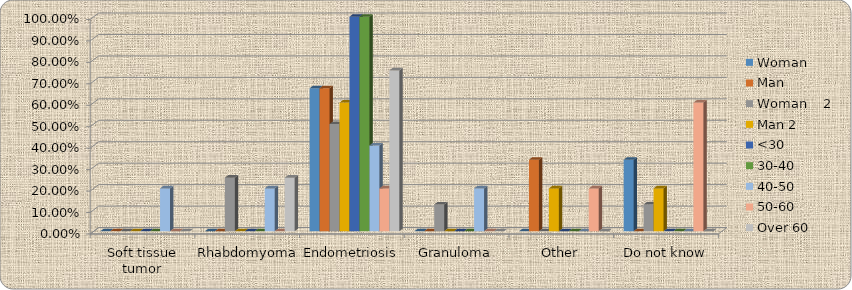
| Category | Woman     | Man  | Woman    2 | Man 2 | <30 | 30-40 | 40-50 | 50-60 | Over 60 |
|---|---|---|---|---|---|---|---|---|---|
| Soft tissue tumor | 0 | 0 | 0 | 0 | 0 | 0 | 0.2 | 0 | 0 |
| Rhabdomyoma | 0 | 0 | 0.25 | 0 | 0 | 0 | 0.2 | 0 | 0.25 |
| Endometriosis | 0.667 | 0.667 | 0.5 | 0.6 | 1 | 1 | 0.4 | 0.2 | 0.75 |
| Granuloma | 0 | 0 | 0.125 | 0 | 0 | 0 | 0.2 | 0 | 0 |
| Other | 0 | 0.333 | 0 | 0.2 | 0 | 0 | 0 | 0.2 | 0 |
| Do not know | 0.333 | 0 | 0.125 | 0.2 | 0 | 0 | 0 | 0.6 | 0 |